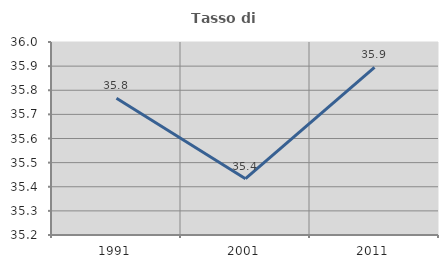
| Category | Tasso di occupazione   |
|---|---|
| 1991.0 | 35.766 |
| 2001.0 | 35.434 |
| 2011.0 | 35.894 |